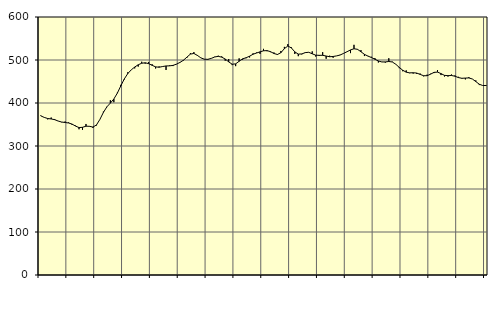
| Category | Piggar | Series 1 |
|---|---|---|
| nan | 371.2 | 370.12 |
| 87.0 | 366.7 | 366.5 |
| 87.0 | 361.9 | 363.95 |
| 87.0 | 366.2 | 362.88 |
| nan | 362.8 | 361.24 |
| 88.0 | 358.2 | 358.05 |
| 88.0 | 355.3 | 355.75 |
| 88.0 | 357 | 354.68 |
| nan | 354.8 | 353.52 |
| 89.0 | 349.2 | 350.98 |
| 89.0 | 347.4 | 346.34 |
| 89.0 | 338.9 | 342.83 |
| nan | 337.6 | 343.46 |
| 90.0 | 351.2 | 346.04 |
| 90.0 | 346.3 | 345.77 |
| 90.0 | 342 | 344.07 |
| nan | 347.7 | 348.83 |
| 91.0 | 362.1 | 361.9 |
| 91.0 | 380 | 378.06 |
| 91.0 | 390.4 | 391.03 |
| nan | 406.4 | 399.75 |
| 92.0 | 401.8 | 409.29 |
| 92.0 | 423.9 | 422.83 |
| 92.0 | 442.3 | 439.75 |
| nan | 454.7 | 455.88 |
| 93.0 | 471.4 | 468.32 |
| 93.0 | 477.1 | 477.14 |
| 93.0 | 480.5 | 483.62 |
| nan | 484.7 | 488.86 |
| 94.0 | 495.9 | 492.41 |
| 94.0 | 491.4 | 493.54 |
| 94.0 | 495.4 | 491.53 |
| nan | 490.1 | 487.62 |
| 95.0 | 480.3 | 484.05 |
| 95.0 | 485 | 483.17 |
| 95.0 | 484.4 | 484.81 |
| nan | 476.8 | 486.15 |
| 96.0 | 487.5 | 486.38 |
| 96.0 | 485.9 | 487.44 |
| 96.0 | 490 | 490.4 |
| nan | 493.9 | 494.35 |
| 97.0 | 498.6 | 499.47 |
| 97.0 | 505.2 | 506.67 |
| 97.0 | 515.9 | 513.71 |
| nan | 518.4 | 515.19 |
| 98.0 | 511.7 | 510.69 |
| 98.0 | 505.2 | 504.97 |
| 98.0 | 502.2 | 501.86 |
| nan | 500.5 | 501.54 |
| 99.0 | 503.6 | 503.77 |
| 99.0 | 507.6 | 507.08 |
| 99.0 | 509.9 | 508.47 |
| nan | 508.4 | 506.64 |
| 0.0 | 498.3 | 502.28 |
| 0.0 | 502.3 | 495.69 |
| 0.0 | 488.1 | 490.14 |
| nan | 485.7 | 491 |
| 1.0 | 503.8 | 497.09 |
| 1.0 | 500.6 | 502.7 |
| 1.0 | 504.1 | 505.24 |
| nan | 505.9 | 508.81 |
| 2.0 | 515.5 | 513.4 |
| 2.0 | 517.3 | 516.24 |
| 2.0 | 514.4 | 518.96 |
| nan | 525.9 | 521.43 |
| 3.0 | 520.5 | 521.84 |
| 3.0 | 518.3 | 519.44 |
| 3.0 | 517.5 | 515.14 |
| nan | 513.8 | 512.81 |
| 4.0 | 521 | 516.95 |
| 4.0 | 530.5 | 526.44 |
| 4.0 | 537 | 532.45 |
| nan | 529.7 | 528.13 |
| 5.0 | 514 | 518.87 |
| 5.0 | 508.9 | 513.72 |
| 5.0 | 513.1 | 514.11 |
| nan | 516.3 | 517.18 |
| 6.0 | 517.7 | 517.93 |
| 6.0 | 520 | 514.42 |
| 6.0 | 508.1 | 511.24 |
| nan | 509.4 | 510.84 |
| 7.0 | 518.2 | 510.91 |
| 7.0 | 502.9 | 509.26 |
| 7.0 | 510 | 507.58 |
| nan | 505.2 | 508.18 |
| 8.0 | 509.6 | 509.55 |
| 8.0 | 511.9 | 511.53 |
| 8.0 | 515.6 | 515.3 |
| nan | 519.3 | 519.27 |
| 9.0 | 516 | 523.38 |
| 9.0 | 535.3 | 526.19 |
| 9.0 | 525.4 | 524.84 |
| nan | 523 | 519.22 |
| 10.0 | 509.2 | 513.11 |
| 10.0 | 509.5 | 509.12 |
| 10.0 | 507.5 | 505.81 |
| nan | 504.6 | 501.72 |
| 11.0 | 494.2 | 497.81 |
| 11.0 | 495.3 | 495.49 |
| 11.0 | 493.9 | 495.51 |
| nan | 504.1 | 496.54 |
| 12.0 | 496.1 | 495.36 |
| 12.0 | 490.5 | 490.2 |
| 12.0 | 481 | 482.8 |
| nan | 473.9 | 476.22 |
| 13.0 | 475.8 | 471.67 |
| 13.0 | 469.4 | 470.06 |
| 13.0 | 468.4 | 470.37 |
| nan | 467.8 | 469.66 |
| 14.0 | 468.5 | 466.53 |
| 14.0 | 462.1 | 463.41 |
| 14.0 | 465.9 | 463.44 |
| nan | 468 | 467.09 |
| 15.0 | 469.6 | 471.24 |
| 15.0 | 476.6 | 471.85 |
| 15.0 | 464.9 | 468.32 |
| nan | 461.7 | 464.26 |
| 16.0 | 461.5 | 463.61 |
| 16.0 | 466.3 | 463.98 |
| 16.0 | 464 | 462.31 |
| nan | 460.9 | 459.14 |
| 17.0 | 456.7 | 457.46 |
| 17.0 | 454.9 | 457.96 |
| 17.0 | 460.2 | 458.3 |
| nan | 455.9 | 455.83 |
| 18.0 | 452.5 | 449.86 |
| 18.0 | 441.7 | 443.64 |
| 18.0 | 440.5 | 440.65 |
| nan | 441.8 | 440.7 |